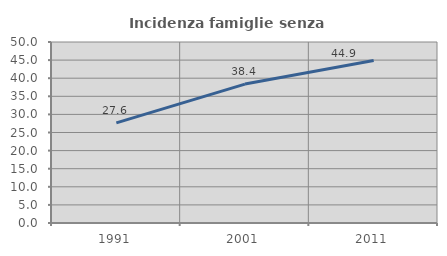
| Category | Incidenza famiglie senza nuclei |
|---|---|
| 1991.0 | 27.642 |
| 2001.0 | 38.372 |
| 2011.0 | 44.876 |